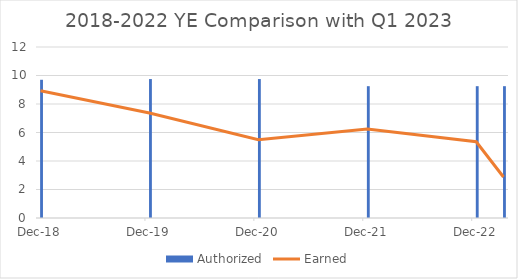
| Category | Authorized |
|---|---|
| Dec-18 | 9.7 |
| Dec-19 | 9.75 |
| Dec-20 | 9.75 |
| Dec-21 | 9.25 |
| Dec-22 | 9.25 |
| Mar-23 | 9.25 |